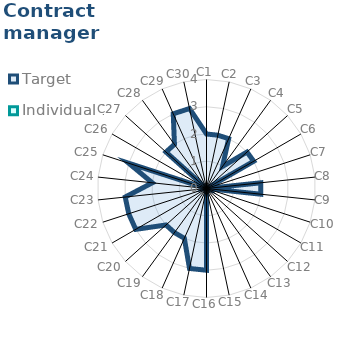
| Category | Target | Individual 1 |
|---|---|---|
| C1 | 2 | 0 |
| C2 | 2 | 0 |
| C3 | 2 | 0 |
| C4 | 1 | 0 |
| C5 | 2 | 0 |
| C6 | 2 | 0 |
| C7 | 0 | 0 |
| C8 | 2 | 0 |
| C9 | 2 | 0 |
| C10 | 0 | 0 |
| C11 | 0 | 0 |
| C12 | 0 | 0 |
| C13 | 0 | 0 |
| C14 | 0 | 0 |
| C15 | 0 | 0 |
| C16 | 3 | 0 |
| C17 | 3 | 0 |
| C18 | 2 | 0 |
| C19 | 2 | 0 |
| C20 | 2 | 0 |
| C21 | 3 | 0 |
| C22 | 3 | 0 |
| C23 | 3 | 0 |
| C24 | 2 | 0 |
| C25 | 3 | 0 |
| C26 | 0 | 0 |
| C27 | 2 | 0 |
| C28 | 2 | 0 |
| C29 | 3 | 0 |
| C30 | 3 | 0 |